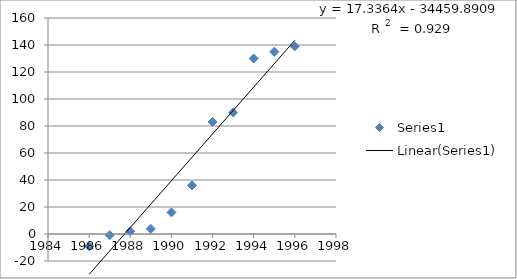
| Category | Series 0 |
|---|---|
| 1986.0 | -9 |
| 1987.0 | -0.9 |
| 1988.0 | 2 |
| 1989.0 | 3.8 |
| 1990.0 | 16 |
| 1991.0 | 36 |
| 1992.0 | 83 |
| 1993.0 | 90 |
| 1994.0 | 130 |
| 1995.0 | 135 |
| 1996.0 | 139 |